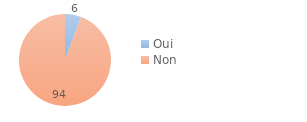
| Category | Series 0 |
|---|---|
| Oui | 5.7 |
| Non | 94.3 |